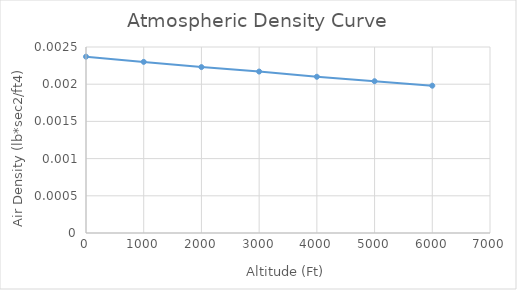
| Category | Series 0 |
|---|---|
| 0.0 | 0.002 |
| 1000.0 | 0.002 |
| 2000.0 | 0.002 |
| 3000.0 | 0.002 |
| 4000.0 | 0.002 |
| 5000.0 | 0.002 |
| 6000.0 | 0.002 |